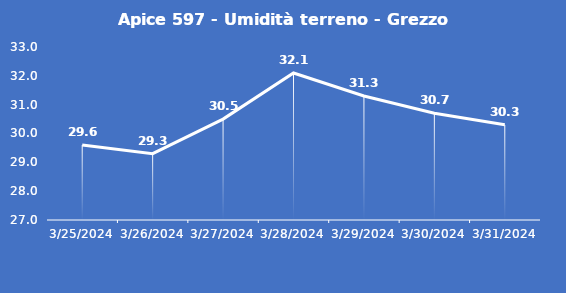
| Category | Apice 597 - Umidità terreno - Grezzo (%VWC) |
|---|---|
| 3/25/24 | 29.6 |
| 3/26/24 | 29.3 |
| 3/27/24 | 30.5 |
| 3/28/24 | 32.1 |
| 3/29/24 | 31.3 |
| 3/30/24 | 30.7 |
| 3/31/24 | 30.3 |